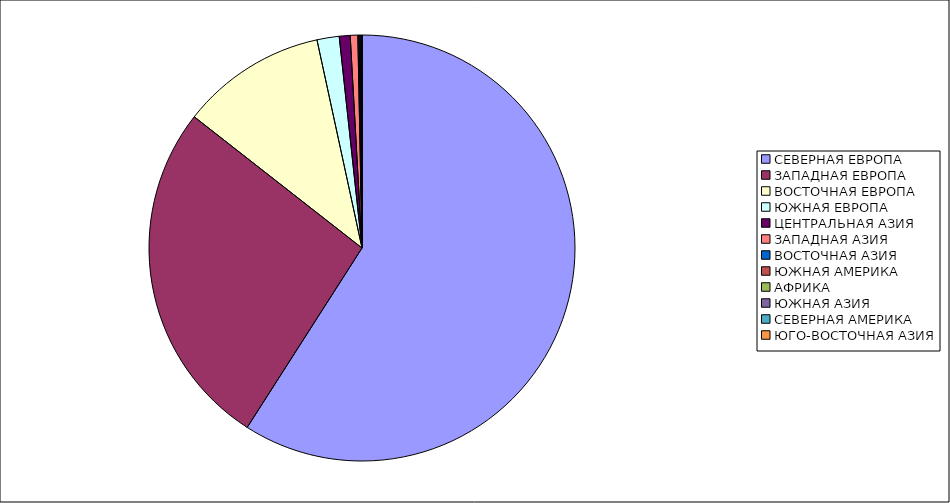
| Category | Оборот |
|---|---|
| СЕВЕРНАЯ ЕВРОПА | 59.059 |
| ЗАПАДНАЯ ЕВРОПА | 26.504 |
| ВОСТОЧНАЯ ЕВРОПА | 11.045 |
| ЮЖНАЯ ЕВРОПА | 1.683 |
| ЦЕНТРАЛЬНАЯ АЗИЯ | 0.825 |
| ЗАПАДНАЯ АЗИЯ | 0.575 |
| ВОСТОЧНАЯ АЗИЯ | 0.091 |
| ЮЖНАЯ АМЕРИКА | 0.087 |
| АФРИКА | 0.076 |
| ЮЖНАЯ АЗИЯ | 0.052 |
| СЕВЕРНАЯ АМЕРИКА | 0.003 |
| ЮГО-ВОСТОЧНАЯ АЗИЯ | 0 |